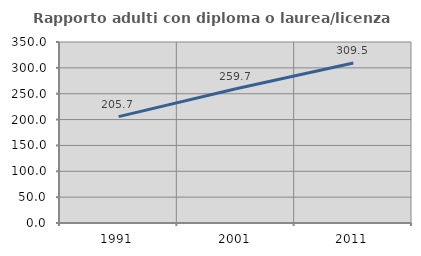
| Category | Rapporto adulti con diploma o laurea/licenza media  |
|---|---|
| 1991.0 | 205.669 |
| 2001.0 | 259.727 |
| 2011.0 | 309.489 |